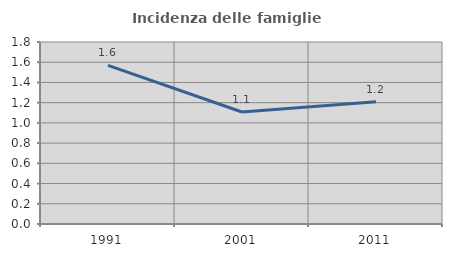
| Category | Incidenza delle famiglie numerose |
|---|---|
| 1991.0 | 1.568 |
| 2001.0 | 1.107 |
| 2011.0 | 1.21 |